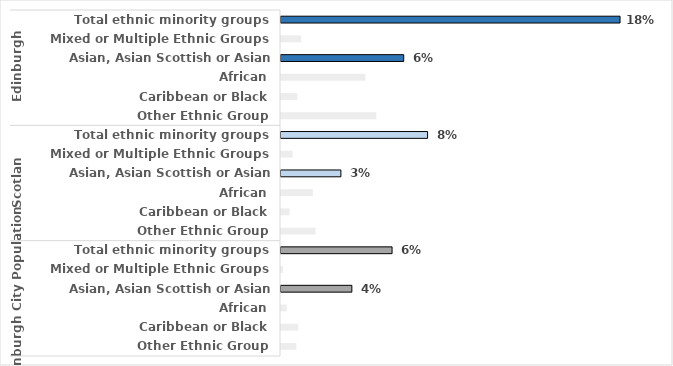
| Category | Series 0 |
|---|---|
| 0 | 0.177 |
| 1 | 0.011 |
| 2 | 0.064 |
| 3 | 0.044 |
| 4 | 0.009 |
| 5 | 0.05 |
| 6 | 0.077 |
| 7 | 0.006 |
| 8 | 0.031 |
| 9 | 0.017 |
| 10 | 0.004 |
| 11 | 0.018 |
| 12 | 0.058 |
| 13 | 0.001 |
| 14 | 0.037 |
| 15 | 0.003 |
| 16 | 0.009 |
| 17 | 0.008 |